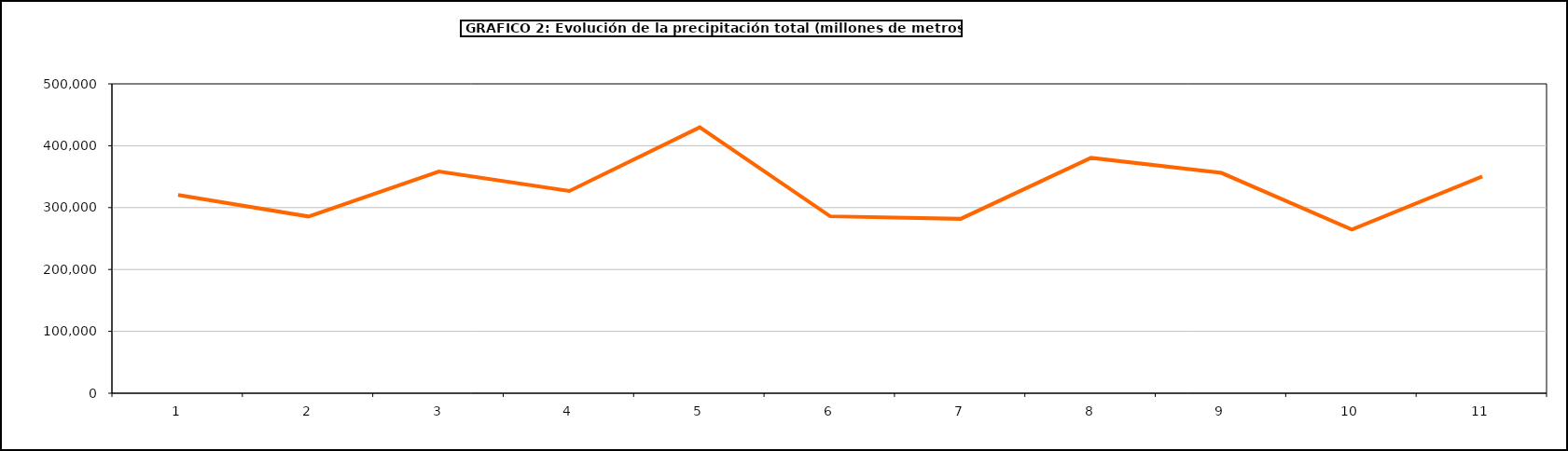
| Category | Series 0 |
|---|---|
| 0 | 320442 |
| 1 | 285630.26 |
| 2 | 358273.25 |
| 3 | 326778 |
| 4 | 429768 |
| 5 | 285948 |
| 6 | 281817 |
| 7 | 380420 |
| 8 | 356097 |
| 9 | 264511.7 |
| 10 | 350442.2 |